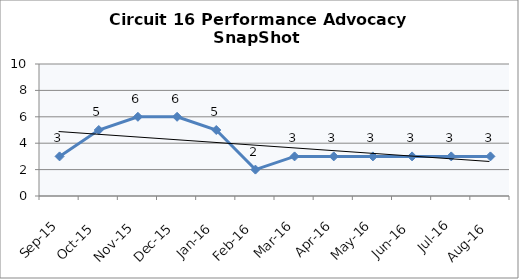
| Category | Circuit 16 |
|---|---|
| Sep-15 | 3 |
| Oct-15 | 5 |
| Nov-15 | 6 |
| Dec-15 | 6 |
| Jan-16 | 5 |
| Feb-16 | 2 |
| Mar-16 | 3 |
| Apr-16 | 3 |
| May-16 | 3 |
| Jun-16 | 3 |
| Jul-16 | 3 |
| Aug-16 | 3 |